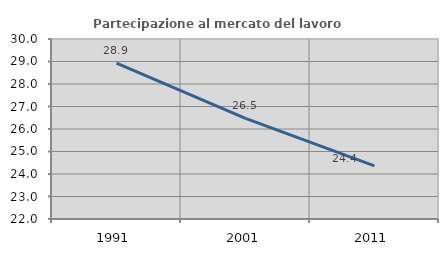
| Category | Partecipazione al mercato del lavoro  femminile |
|---|---|
| 1991.0 | 28.929 |
| 2001.0 | 26.476 |
| 2011.0 | 24.361 |